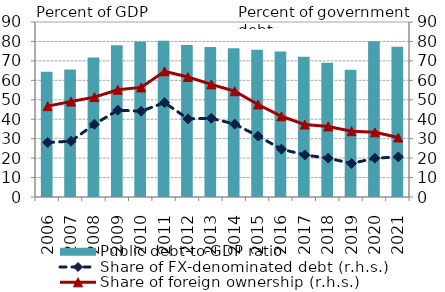
| Category | Public debt-to-GDP ratio |
|---|---|
| 2006.0 | 64.407 |
| 2007.0 | 65.531 |
| 2008.0 | 71.735 |
| 2009.0 | 78.005 |
| 2010.0 | 79.973 |
| 2011.0 | 80.306 |
| 2012.0 | 78.129 |
| 2013.0 | 77.171 |
| 2014.0 | 76.517 |
| 2015.0 | 75.739 |
| 2016.0 | 74.835 |
| 2017.0 | 72.102 |
| 2018.0 | 69.069 |
| 2019.0 | 65.496 |
| 2020.0 | 80.038 |
| 2021.0 | 77.257 |